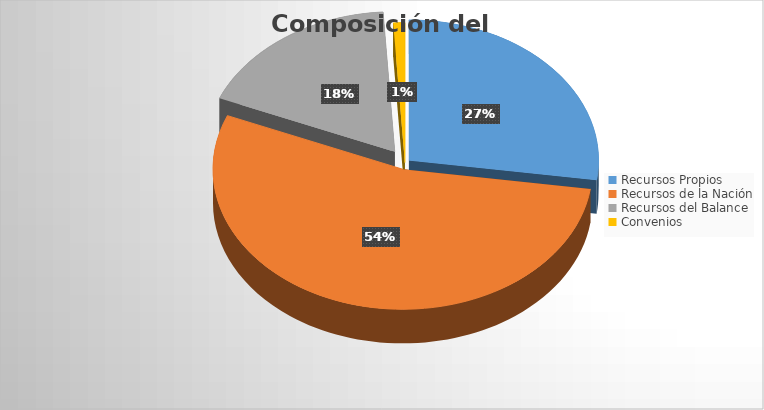
| Category | Series 0 |
|---|---|
| Recursos Propios | 49205363241.176 |
| Recursos de la Nación | 97545603164.82 |
| Recursos del Balance | 32095283336.71 |
| Convenios | 1775223529 |